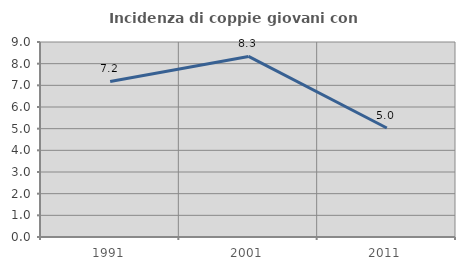
| Category | Incidenza di coppie giovani con figli |
|---|---|
| 1991.0 | 7.179 |
| 2001.0 | 8.333 |
| 2011.0 | 5.031 |